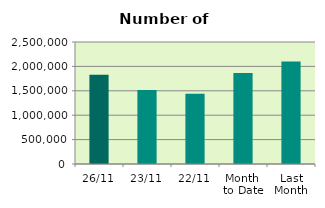
| Category | Series 0 |
|---|---|
| 26/11 | 1828150 |
| 23/11 | 1516492 |
| 22/11 | 1439378 |
| Month 
to Date | 1867142.222 |
| Last
Month | 2101052.87 |